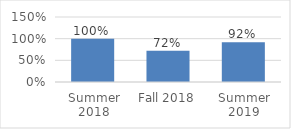
| Category | Series 0 |
|---|---|
| Summer 2018 | 1 |
| Fall 2018 | 0.72 |
| Summer 2019 | 0.92 |